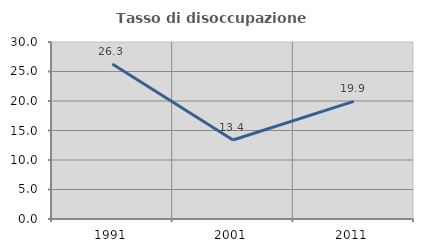
| Category | Tasso di disoccupazione giovanile  |
|---|---|
| 1991.0 | 26.263 |
| 2001.0 | 13.391 |
| 2011.0 | 19.944 |